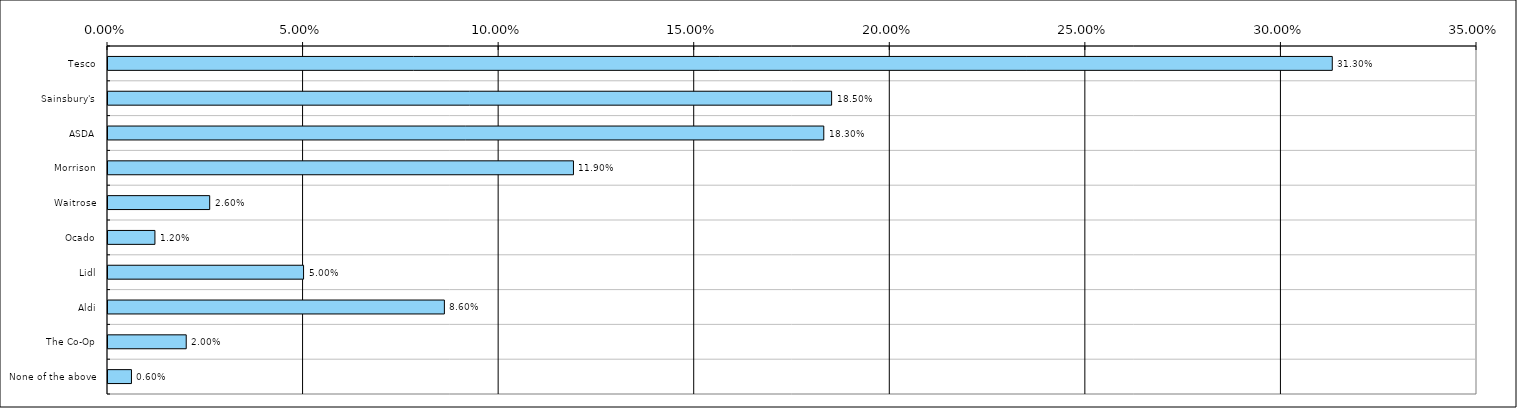
| Category | Total(United Kingdom) |
|---|---|
| Tesco | 0.313 |
| Sainsbury's | 0.185 |
| ASDA | 0.183 |
| Morrison | 0.119 |
| Waitrose | 0.026 |
| Ocado | 0.012 |
| Lidl | 0.05 |
| Aldi | 0.086 |
| The Co-Op | 0.02 |
| None of the above | 0.006 |